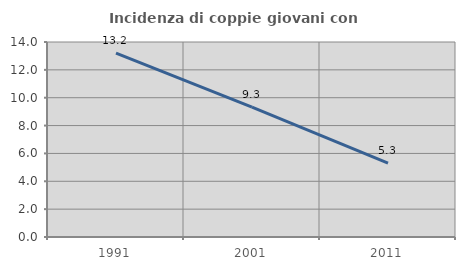
| Category | Incidenza di coppie giovani con figli |
|---|---|
| 1991.0 | 13.194 |
| 2001.0 | 9.317 |
| 2011.0 | 5.298 |